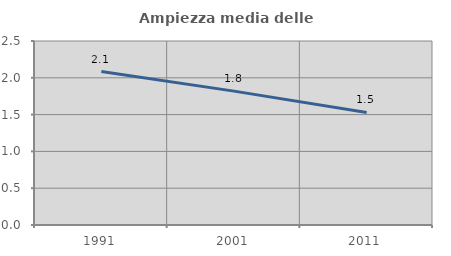
| Category | Ampiezza media delle famiglie |
|---|---|
| 1991.0 | 2.085 |
| 2001.0 | 1.819 |
| 2011.0 | 1.529 |